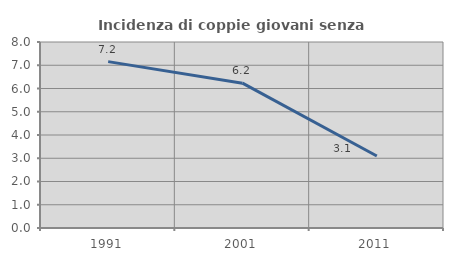
| Category | Incidenza di coppie giovani senza figli |
|---|---|
| 1991.0 | 7.156 |
| 2001.0 | 6.229 |
| 2011.0 | 3.098 |